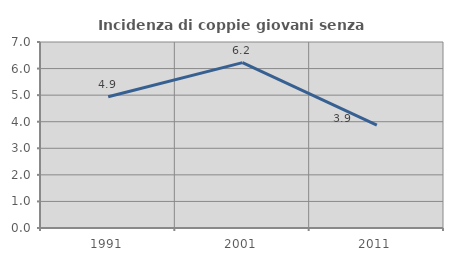
| Category | Incidenza di coppie giovani senza figli |
|---|---|
| 1991.0 | 4.941 |
| 2001.0 | 6.225 |
| 2011.0 | 3.871 |